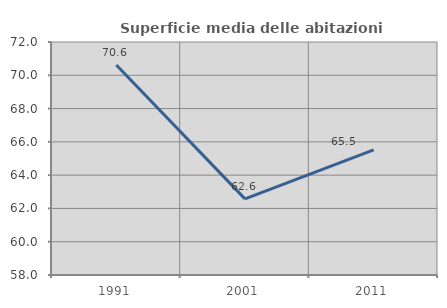
| Category | Superficie media delle abitazioni occupate |
|---|---|
| 1991.0 | 70.615 |
| 2001.0 | 62.573 |
| 2011.0 | 65.52 |